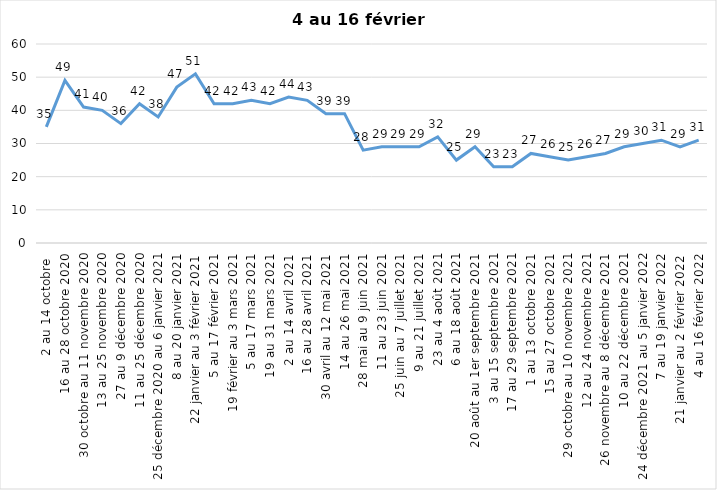
| Category | Toujours aux trois mesures |
|---|---|
| 2 au 14 octobre  | 35 |
| 16 au 28 octobre 2020 | 49 |
| 30 octobre au 11 novembre 2020 | 41 |
| 13 au 25 novembre 2020 | 40 |
| 27 au 9 décembre 2020 | 36 |
| 11 au 25 décembre 2020 | 42 |
| 25 décembre 2020 au 6 janvier 2021 | 38 |
| 8 au 20 janvier 2021 | 47 |
| 22 janvier au 3 février 2021 | 51 |
| 5 au 17 février 2021 | 42 |
| 19 février au 3 mars 2021 | 42 |
| 5 au 17 mars 2021 | 43 |
| 19 au 31 mars 2021 | 42 |
| 2 au 14 avril 2021 | 44 |
| 16 au 28 avril 2021 | 43 |
| 30 avril au 12 mai 2021 | 39 |
| 14 au 26 mai 2021 | 39 |
| 28 mai au 9 juin 2021 | 28 |
| 11 au 23 juin 2021 | 29 |
| 25 juin au 7 juillet 2021 | 29 |
| 9 au 21 juillet 2021 | 29 |
| 23 au 4 août 2021 | 32 |
| 6 au 18 août 2021 | 25 |
| 20 août au 1er septembre 2021 | 29 |
| 3 au 15 septembre 2021 | 23 |
| 17 au 29 septembre 2021 | 23 |
| 1 au 13 octobre 2021 | 27 |
| 15 au 27 octobre 2021 | 26 |
| 29 octobre au 10 novembre 2021 | 25 |
| 12 au 24 novembre 2021 | 26 |
| 26 novembre au 8 décembre 2021 | 27 |
| 10 au 22 décembre 2021 | 29 |
| 24 décembre 2021 au 5 janvier 2022 | 30 |
| 7 au 19 janvier 2022 | 31 |
| 21 janvier au 2 février 2022 | 29 |
| 4 au 16 février 2022 | 31 |